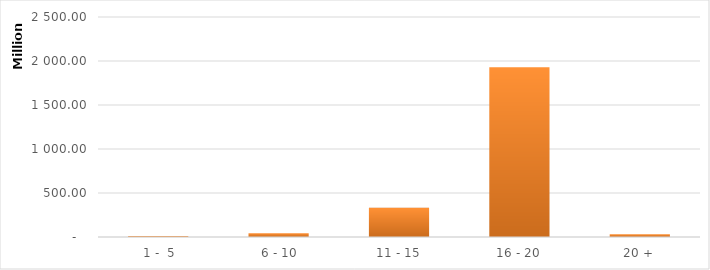
| Category | Series 0 |
|---|---|
|  1 -  5 | 10077669.97 |
|  6 - 10 | 41707867.62 |
| 11 - 15 | 331005014.97 |
| 16 - 20 | 1928349919.9 |
| 20 + | 32188487.36 |